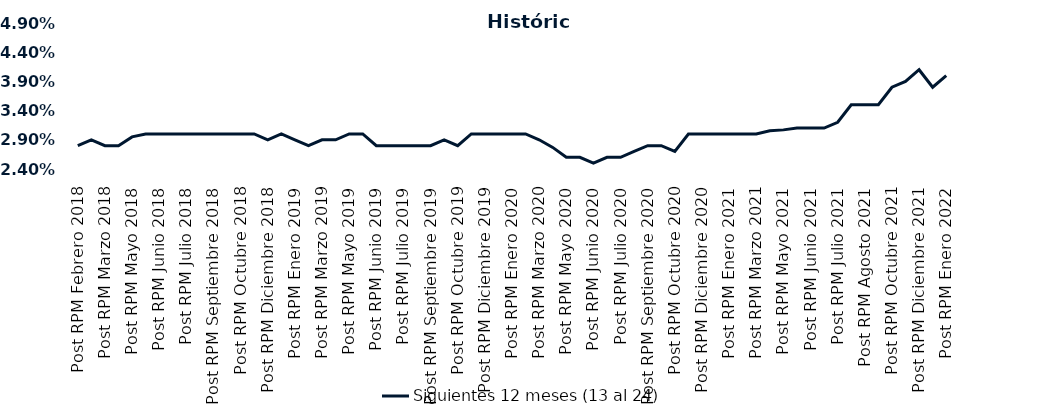
| Category | Siguientes 12 meses (13 al 24)  |
|---|---|
| Post RPM Febrero 2018 | 0.028 |
| Pre RPM Marzo 2018 | 0.029 |
| Post RPM Marzo 2018 | 0.028 |
| Pre RPM Mayo 2018 | 0.028 |
| Post RPM Mayo 2018 | 0.03 |
| Pre RPM Junio 2018 | 0.03 |
| Post RPM Junio 2018 | 0.03 |
| Pre RPM Julio 2018 | 0.03 |
| Post RPM Julio 2018 | 0.03 |
| Pre RPM Septiembre 2018 | 0.03 |
| Post RPM Septiembre 2018 | 0.03 |
| Pre RPM Octubre 2018 | 0.03 |
| Post RPM Octubre 2018 | 0.03 |
| Pre RPM Diciembre 2018 | 0.03 |
| Post RPM Diciembre 2018 | 0.029 |
| Pre RPM Enero 2019 | 0.03 |
| Post RPM Enero 2019 | 0.029 |
| Pre RPM Marzo 2019 | 0.028 |
| Post RPM Marzo 2019 | 0.029 |
| Pre RPM Mayo 2019 | 0.029 |
| Post RPM Mayo 2019 | 0.03 |
| Pre RPM Junio 2019 | 0.03 |
| Post RPM Junio 2019 | 0.028 |
| Pre RPM Julio 2019 | 0.028 |
| Post RPM Julio 2019 | 0.028 |
| Pre RPM Septiembre 2019 | 0.028 |
| Post RPM Septiembre 2019 | 0.028 |
| Pre RPM Octubre 2019 | 0.029 |
| Post RPM Octubre 2019 | 0.028 |
| Pre RPM Diciembre 2019 | 0.03 |
| Post RPM Diciembre 2019 | 0.03 |
| Pre RPM Enero 2020 | 0.03 |
| Post RPM Enero 2020 | 0.03 |
| Pre RPM Marzo 2020 | 0.03 |
| Post RPM Marzo 2020 | 0.029 |
| Pre RPM Mayo 2020 | 0.028 |
| Post RPM Mayo 2020 | 0.026 |
| Pre RPM Junio 2020 | 0.026 |
| Post RPM Junio 2020 | 0.025 |
| Pre RPM Julio 2020 | 0.026 |
| Post RPM Julio 2020 | 0.026 |
| Pre RPM Septiembre 2020 | 0.027 |
| Post RPM Septiembre 2020 | 0.028 |
| Pre RPM Octubre 2020 | 0.028 |
| Post RPM Octubre 2020 | 0.027 |
| Pre RPM Diciembre 2020 | 0.03 |
| Post RPM Diciembre 2020 | 0.03 |
| Pre RPM Enero 2021 | 0.03 |
| Post RPM Enero 2021 | 0.03 |
| Pre RPM Marzo 2021 | 0.03 |
| Post RPM Marzo 2021 | 0.03 |
| Pre RPM Mayo 2021 | 0.031 |
| Post RPM Mayo 2021 | 0.031 |
| Pre RPM Junio 2021 | 0.031 |
| Post RPM Junio 2021 | 0.031 |
| Pre RPM Julio 2021 | 0.031 |
| Post RPM Julio 2021 | 0.032 |
| Pre RPM Agosto 2021 | 0.035 |
| Post RPM Agosto 2021 | 0.035 |
| Pre RPM Octubre 2021 | 0.035 |
| Post RPM Octubre 2021 | 0.038 |
| Pre RPM Diciembre 2021 | 0.039 |
| Post RPM Diciembre 2021 | 0.041 |
| Pre RPM Enero 2022 | 0.038 |
| Post RPM Enero 2022 | 0.04 |